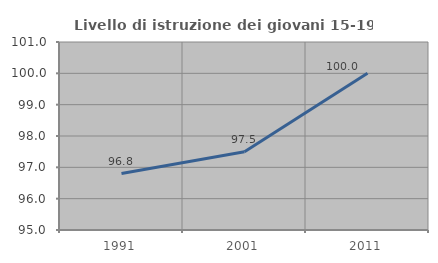
| Category | Livello di istruzione dei giovani 15-19 anni |
|---|---|
| 1991.0 | 96.8 |
| 2001.0 | 97.5 |
| 2011.0 | 100 |